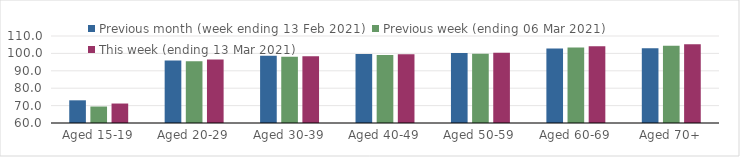
| Category | Previous month (week ending 13 Feb 2021) | Previous week (ending 06 Mar 2021) | This week (ending 13 Mar 2021) |
|---|---|---|---|
| Aged 15-19 | 73.04 | 69.47 | 71.19 |
| Aged 20-29 | 95.88 | 95.5 | 96.48 |
| Aged 30-39 | 98.7 | 98.01 | 98.43 |
| Aged 40-49 | 99.62 | 99.12 | 99.56 |
| Aged 50-59 | 100.22 | 99.85 | 100.41 |
| Aged 60-69 | 102.82 | 103.46 | 104.18 |
| Aged 70+ | 103.03 | 104.37 | 105.22 |